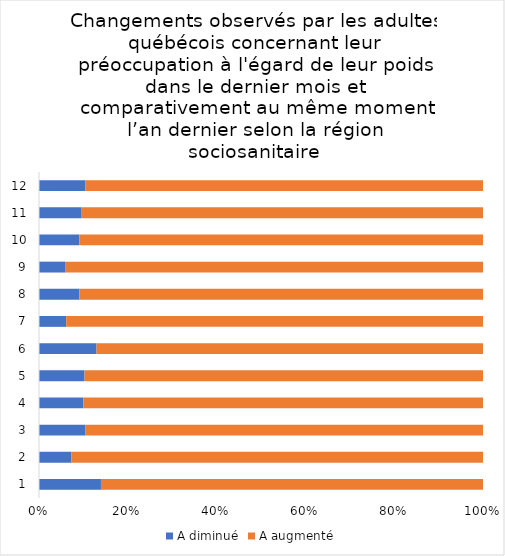
| Category | A diminué | A augmenté |
|---|---|---|
| 0 | 6 | 37 |
| 1 | 3 | 38 |
| 2 | 5 | 43 |
| 3 | 4 | 36 |
| 4 | 4 | 35 |
| 5 | 7 | 47 |
| 6 | 3 | 46 |
| 7 | 4 | 40 |
| 8 | 3 | 47 |
| 9 | 4 | 40 |
| 10 | 5 | 47 |
| 11 | 5 | 43 |